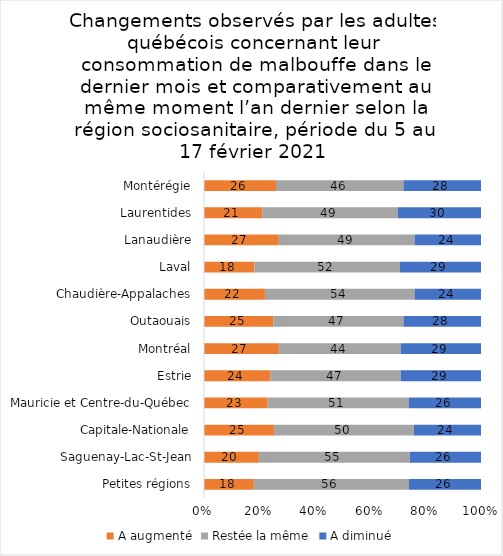
| Category | A augmenté | Restée la même | A diminué |
|---|---|---|---|
| Petites régions | 18 | 56 | 26 |
| Saguenay-Lac-St-Jean | 20 | 55 | 26 |
| Capitale-Nationale | 25 | 50 | 24 |
| Mauricie et Centre-du-Québec | 23 | 51 | 26 |
| Estrie | 24 | 47 | 29 |
| Montréal | 27 | 44 | 29 |
| Outaouais | 25 | 47 | 28 |
| Chaudière-Appalaches | 22 | 54 | 24 |
| Laval | 18 | 52 | 29 |
| Lanaudière | 27 | 49 | 24 |
| Laurentides | 21 | 49 | 30 |
| Montérégie | 26 | 46 | 28 |